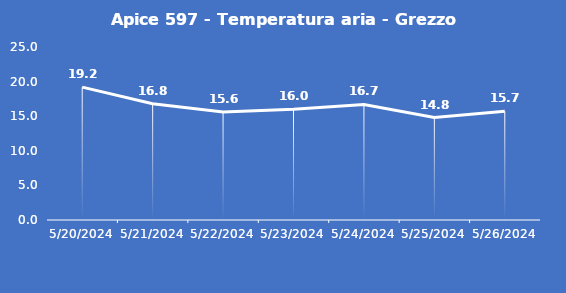
| Category | Apice 597 - Temperatura aria - Grezzo (°C) |
|---|---|
| 5/20/24 | 19.2 |
| 5/21/24 | 16.8 |
| 5/22/24 | 15.6 |
| 5/23/24 | 16 |
| 5/24/24 | 16.7 |
| 5/25/24 | 14.8 |
| 5/26/24 | 15.7 |